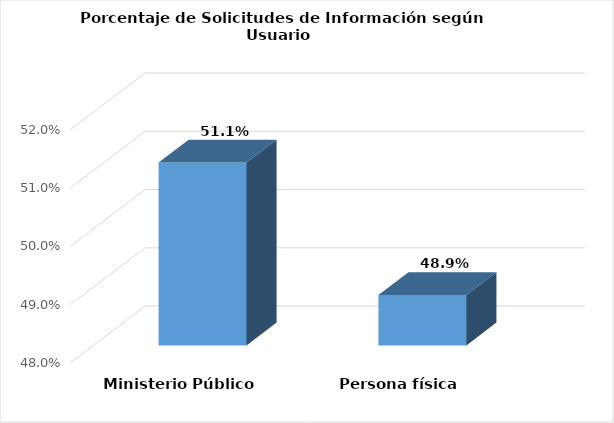
| Category | Series 0 |
|---|---|
| Ministerio Público | 0.511 |
| Persona física | 0.489 |